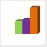
| Category | област Смолян |
|---|---|
| летен сезон 2019  | 258594 |
| летен сезон 2021  | 260773 |
| летен сезон 2022 г.  | 278505 |